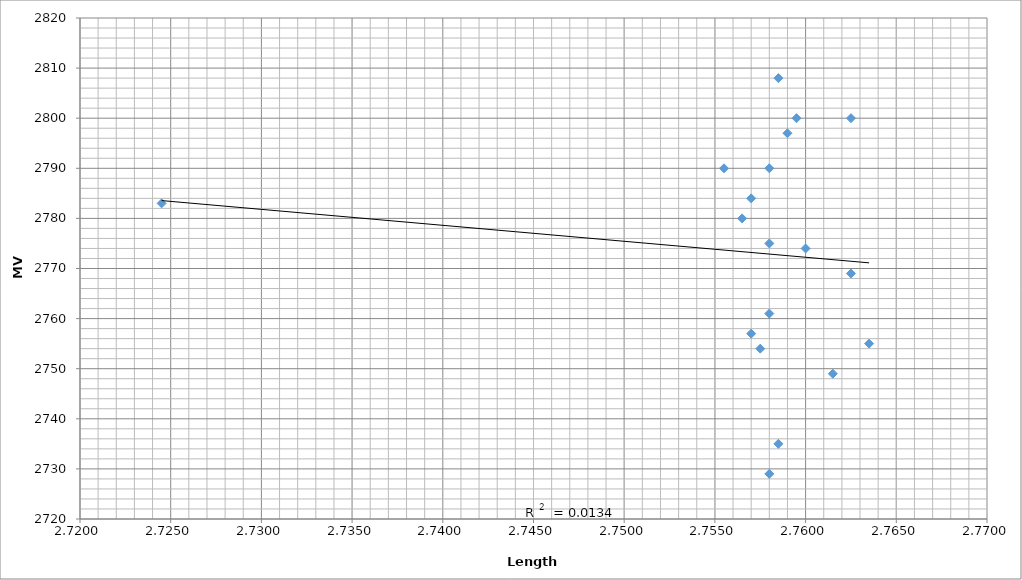
| Category | MV (fps) |
|---|---|
| 2.7615 | 2783 |
| 2.758 | 2749 |
| 2.7625 | 2790 |
| 2.7555 | 2800 |
| 2.7585 | 2790 |
| 2.758 | 2808 |
| 2.7625 | 2761 |
| 2.76 | 2769 |
| 2.758 | 2774 |
| 2.759 | 2729 |
| 2.7595 | 2797 |
| 2.757 | 2800 |
| 2.7585 | 2757 |
| 2.7635 | 2735 |
| 2.757 | 2755 |
| 2.758 | 2784 |
| 2.7565 | 2775 |
| 2.7575 | 2780 |
| 2.7575 | 2754 |